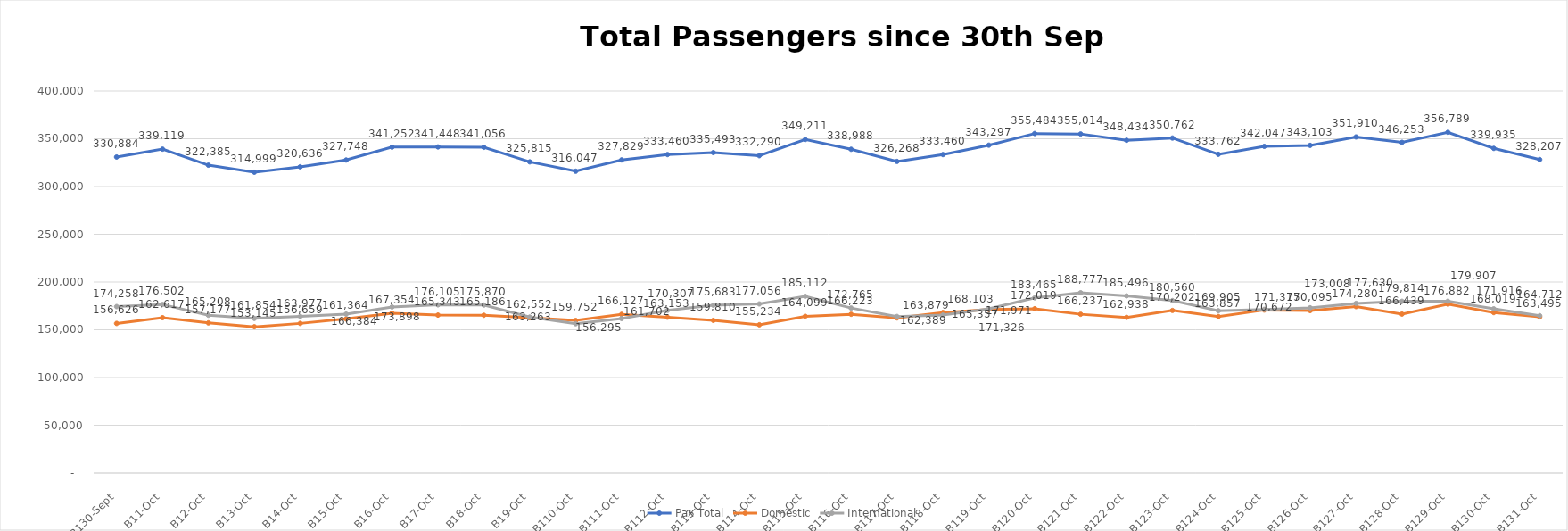
| Category | Pax Total | Domestic | International |
|---|---|---|---|
| 2023-09-30 | 330884 | 156626 | 174258 |
| 2023-10-01 | 339119 | 162617 | 176502 |
| 2023-10-02 | 322385 | 157177 | 165208 |
| 2023-10-03 | 314999 | 153145 | 161854 |
| 2023-10-04 | 320636 | 156659 | 163977 |
| 2023-10-05 | 327748 | 161364 | 166384 |
| 2023-10-06 | 341252 | 167354 | 173898 |
| 2023-10-07 | 341448 | 165343 | 176105 |
| 2023-10-08 | 341056 | 165186 | 175870 |
| 2023-10-09 | 325815 | 162552 | 163263 |
| 2023-10-10 | 316047 | 159752 | 156295 |
| 2023-10-11 | 327829 | 166127 | 161702 |
| 2023-10-12 | 333460 | 163153 | 170307 |
| 2023-10-13 | 335493 | 159810 | 175683 |
| 2023-10-14 | 332290 | 155234 | 177056 |
| 2023-10-15 | 349211 | 164099 | 185112 |
| 2023-10-16 | 338988 | 166223 | 172765 |
| 2023-10-17 | 326268 | 162389 | 163879 |
| 2023-10-18 | 333460 | 168103 | 165357 |
| 2023-10-19 | 343297 | 171326 | 171971 |
| 2023-10-20 | 355484 | 172019 | 183465 |
| 2023-10-21 | 355014 | 166237 | 188777 |
| 2023-10-22 | 348434 | 162938 | 185496 |
| 2023-10-23 | 350762 | 170202 | 180560 |
| 2023-10-24 | 333762 | 163857 | 169905 |
| 2023-10-25 | 342047 | 170672 | 171375 |
| 2023-10-26 | 343103 | 170095 | 173008 |
| 2023-10-27 | 351910 | 174280 | 177630 |
| 2023-10-28 | 346253 | 166439 | 179814 |
| 2023-10-29 | 356789 | 176882 | 179907 |
| 2023-10-30 | 339935 | 168019 | 171916 |
| 2023-10-31 | 328207 | 163495 | 164712 |